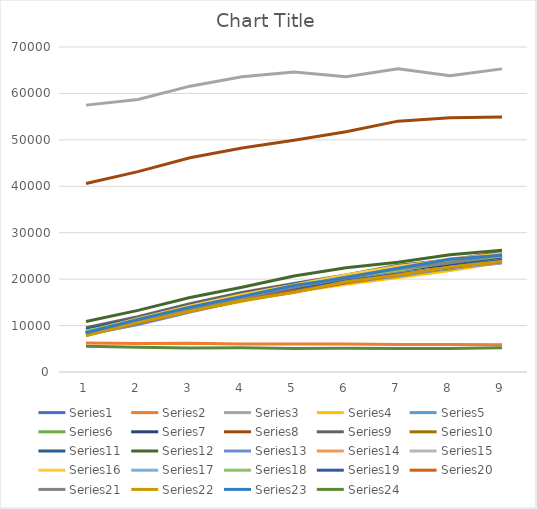
| Category | Series 0 | Series 1 | Series 2 | Series 3 | Series 4 | Series 5 | Series 6 | Series 7 | Series 8 | Series 9 | Series 10 | Series 11 | Series 12 | Series 13 | Series 14 | Series 15 | Series 16 | Series 17 | Series 18 | Series 19 | Series 20 | Series 21 | Series 22 | Series 23 |
|---|---|---|---|---|---|---|---|---|---|---|---|---|---|---|---|---|---|---|---|---|---|---|---|---|
| 0 | 8390 | 6260 | 57481 | 8146 | 8590 | 8262 | 8390 | 40585 | 9548 | 8533 | 9184 | 10889 | 8092 | 8479 | 8820 | 8670 | 8227 | 8785 | 8254 | 7831 | 8345 | 7856 | 8443 | 5564 |
| 1 | 11164 | 6131 | 58710 | 10265 | 11392 | 10586 | 11032 | 43162 | 11931 | 11182 | 11498 | 13271 | 10215 | 11204 | 10879 | 11462 | 10716 | 11035 | 10601 | 10573 | 10876 | 10695 | 11309 | 5348 |
| 2 | 13611 | 6203 | 61567 | 13075 | 13696 | 13193 | 13793 | 46132 | 14693 | 13711 | 14356 | 16051 | 12898 | 14105 | 13248 | 14228 | 13346 | 13577 | 13645 | 13052 | 13743 | 13079 | 13966 | 5194 |
| 3 | 16050 | 6025 | 63580 | 15231 | 16374 | 15719 | 16120 | 48244 | 17112 | 16051 | 16396 | 18264 | 15434 | 16562 | 15719 | 16661 | 15737 | 15972 | 15628 | 15378 | 15934 | 15385 | 16288 | 5208 |
| 4 | 18442 | 6021 | 64629 | 17259 | 18281 | 17590 | 18360 | 49894 | 19061 | 18340 | 18793 | 20656 | 17237 | 18482 | 17414 | 18743 | 17661 | 18113 | 17746 | 17402 | 18321 | 17144 | 18642 | 5088 |
| 5 | 19907 | 6023 | 63572 | 18902 | 20732 | 19719 | 20207 | 51732 | 20875 | 20285 | 20582 | 22458 | 19270 | 20626 | 19607 | 20878 | 19631 | 20342 | 19589 | 19217 | 20458 | 19459 | 20275 | 5142 |
| 6 | 21587 | 5946 | 65330 | 20352 | 22438 | 21190 | 21922 | 54029 | 23017 | 21908 | 21959 | 23623 | 20657 | 22501 | 21088 | 22806 | 21283 | 21920 | 21134 | 20979 | 22224 | 20865 | 22363 | 5073 |
| 7 | 23654 | 5915 | 63815 | 21876 | 23709 | 22168 | 23159 | 54767 | 24105 | 23621 | 23496 | 25252 | 22420 | 24362 | 22456 | 24056 | 22441 | 23627 | 22499 | 22570 | 23522 | 22600 | 24300 | 5081 |
| 8 | 25152 | 5874 | 65287 | 23653 | 25160 | 24087 | 24489 | 54937 | 25839 | 25000 | 24105 | 26230 | 23453 | 25478 | 23584 | 25480 | 24147 | 24970 | 24067 | 23715 | 25244 | 23783 | 25162 | 5229 |